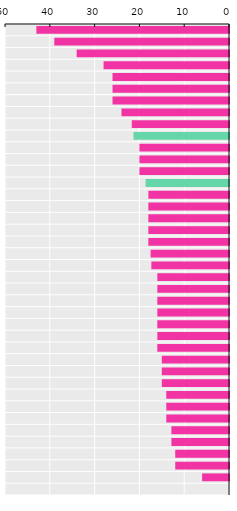
| Category | Length in weeks |
|---|---|
| Greece | 43 |
| United Kingdom | 39 |
| Slovak Republic | 34 |
| Czech Republic | 28 |
| Iceland | 26 |
| New Zealand | 26 |
| Ireland | 26 |
| Hungary | 24 |
| Italy | 21.7 |
| EU average | 21.32 |
| Estonia | 20 |
| Luxembourg | 20 |
| Poland | 20 |
| OECD | 18.612 |
| Chile | 18 |
| Colombia | 18 |
| Norway | 18 |
| Lithuania | 18 |
| Denmark | 18 |
| Finland | 17.5 |
| Costa Rica | 17.333 |
| Spain | 16 |
| Austria | 16 |
| Netherlands | 16 |
| France | 16 |
| Latvia | 16 |
| Türkiye | 16 |
| Canada | 16 |
| Israel | 15 |
| Slovenia | 15 |
| Belgium | 15 |
| Germany | 14 |
| Japan | 14 |
| Switzerland | 14 |
| Korea | 12.857 |
| Sweden | 12.857 |
| Mexico | 12 |
| Australia | 12 |
| Portugal | 6 |
| United States | 0 |